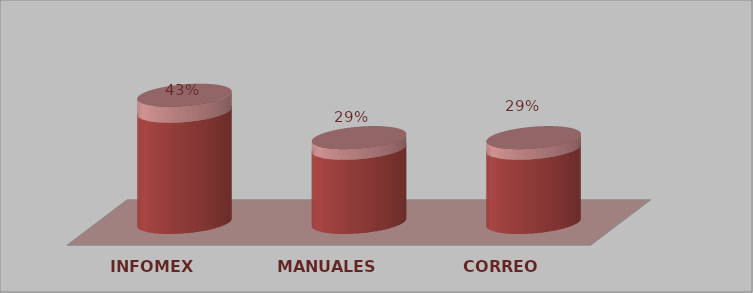
| Category | Series 0 | Series 1 |
|---|---|---|
| INFOMEX | 3 | 0.429 |
| MANUALES | 2 | 0.286 |
| CORREO | 2 | 0.286 |